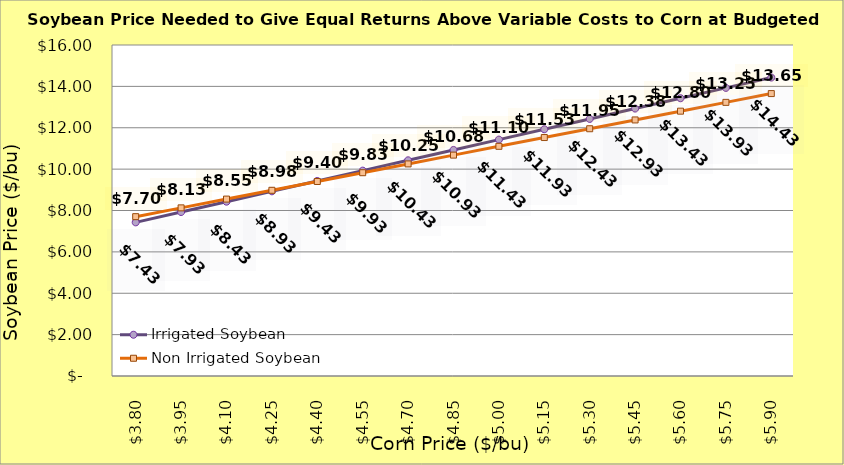
| Category | Irrigated Soybean | Non Irrigated Soybean |
|---|---|---|
| 3.799999999999998 | 7.427 | 7.702 |
| 3.949999999999998 | 7.927 | 8.127 |
| 4.099999999999998 | 8.427 | 8.552 |
| 4.249999999999998 | 8.927 | 8.977 |
| 4.399999999999999 | 9.427 | 9.402 |
| 4.549999999999999 | 9.927 | 9.827 |
| 4.699999999999999 | 10.427 | 10.252 |
| 4.85 | 10.927 | 10.677 |
| 5.0 | 11.427 | 11.102 |
| 5.15 | 11.927 | 11.527 |
| 5.300000000000001 | 12.427 | 11.952 |
| 5.450000000000001 | 12.927 | 12.377 |
| 5.600000000000001 | 13.427 | 12.802 |
| 5.750000000000002 | 13.927 | 13.227 |
| 5.900000000000002 | 14.427 | 13.652 |